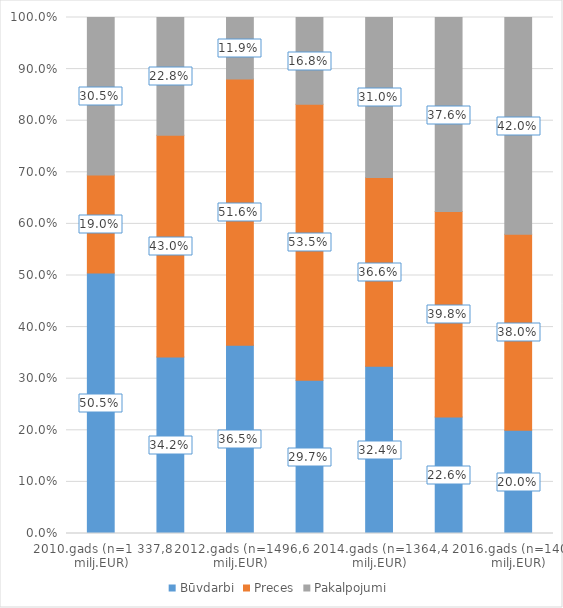
| Category | Būvdarbi | Preces | Pakalpojumi |
|---|---|---|---|
| 2010.gads (n=1 337,8 milj.EUR) | 0.505 | 0.19 | 0.305 |
| 2011.gads (n=867,2 milj.EUR) | 0.342 | 0.43 | 0.228 |
| 2012.gads (n=1496,6 milj.EUR) | 0.365 | 0.516 | 0.119 |
| 2013.gads (n=1255,1 milj.EUR) | 0.297 | 0.535 | 0.168 |
| 2014.gads (n=1364,4 milj.EUR) | 0.324 | 0.366 | 0.31 |
| 2015.gads (n=1170,2 milj.EUR) | 0.226 | 0.398 | 0.376 |
| 2016.gads (n=1408,2 milj.EUR) | 0.2 | 0.38 | 0.42 |